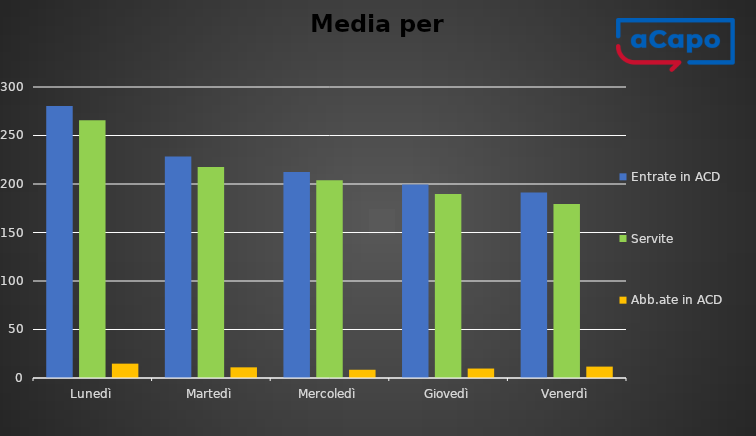
| Category | Entrate in ACD | Servite | Abb.ate in ACD |
|---|---|---|---|
| Lunedì | 280.4 | 265.6 | 14.8 |
| Martedì | 228.4 | 217.4 | 11 |
| Mercoledì | 212.25 | 203.75 | 8.5 |
| Giovedì | 199.5 | 189.75 | 9.75 |
| Venerdì | 191.25 | 179.5 | 11.75 |